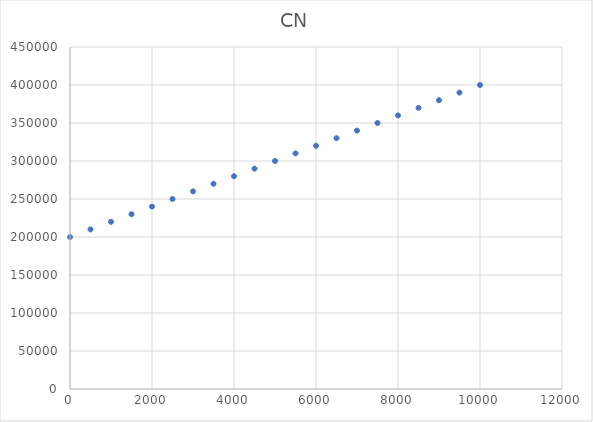
| Category | CN |
|---|---|
| 0.0 | 200000 |
| 500.0 | 210000 |
| 1000.0 | 220000 |
| 1500.0 | 230000 |
| 2000.0 | 240000 |
| 2500.0 | 250000 |
| 3000.0 | 260000 |
| 3500.0 | 270000 |
| 4000.0 | 280000 |
| 4500.0 | 290000 |
| 5000.0 | 300000 |
| 5500.0 | 310000 |
| 6000.0 | 320000 |
| 6500.0 | 330000 |
| 7000.0 | 340000 |
| 7500.0 | 350000 |
| 8000.0 | 360000 |
| 8500.0 | 370000 |
| 9000.0 | 380000 |
| 9500.0 | 390000 |
| 10000.0 | 400000 |